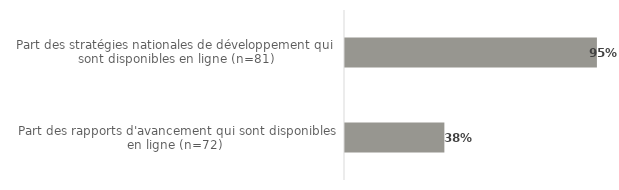
| Category | Series 0 |
|---|---|
| Part des stratégies nationales de développement qui sont disponibles en ligne (n=81) | 0.951 |
|  Part des rapports d'avancement qui sont disponibles en ligne (n=72) | 0.375 |